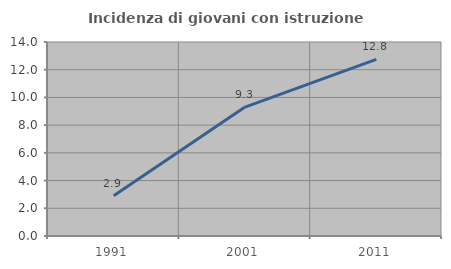
| Category | Incidenza di giovani con istruzione universitaria |
|---|---|
| 1991.0 | 2.913 |
| 2001.0 | 9.302 |
| 2011.0 | 12.752 |